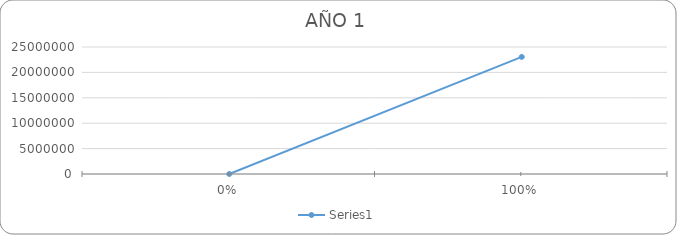
| Category | Series 0 |
|---|---|
| 0.0 | 0 |
| 1.0 | 23051170.787 |